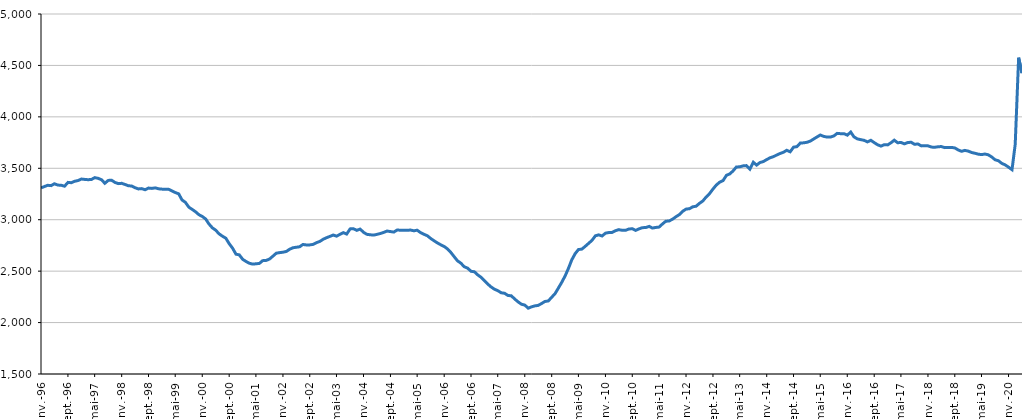
| Category | DEFMA |
|---|---|
| 1996-01-01 | 3309.5 |
| 1996-02-01 | 3322.5 |
| 1996-03-01 | 3334.6 |
| 1996-04-01 | 3331.4 |
| 1996-05-01 | 3349.6 |
| 1996-06-01 | 3336.7 |
| 1996-07-01 | 3335.2 |
| 1996-08-01 | 3325.8 |
| 1996-09-01 | 3362.8 |
| 1996-10-01 | 3359.9 |
| 1996-11-01 | 3374 |
| 1996-12-01 | 3380.7 |
| 1997-01-01 | 3395.5 |
| 1997-02-01 | 3391.6 |
| 1997-03-01 | 3389.2 |
| 1997-04-01 | 3390.8 |
| 1997-05-01 | 3409 |
| 1997-06-01 | 3402.4 |
| 1997-07-01 | 3389 |
| 1997-08-01 | 3354.3 |
| 1997-09-01 | 3382.2 |
| 1997-10-01 | 3383.7 |
| 1997-11-01 | 3362.5 |
| 1997-12-01 | 3350.9 |
| 1998-01-01 | 3353.8 |
| 1998-02-01 | 3342.4 |
| 1998-03-01 | 3330.5 |
| 1998-04-01 | 3327.6 |
| 1998-05-01 | 3311.4 |
| 1998-06-01 | 3299.3 |
| 1998-07-01 | 3302.5 |
| 1998-08-01 | 3291 |
| 1998-09-01 | 3307.6 |
| 1998-10-01 | 3304.4 |
| 1998-11-01 | 3309.6 |
| 1998-12-01 | 3300.6 |
| 1999-01-01 | 3297.3 |
| 1999-02-01 | 3296.1 |
| 1999-03-01 | 3296 |
| 1999-04-01 | 3280.4 |
| 1999-05-01 | 3264.4 |
| 1999-06-01 | 3251.5 |
| 1999-07-01 | 3192.4 |
| 1999-08-01 | 3168.6 |
| 1999-09-01 | 3121.7 |
| 1999-10-01 | 3100.4 |
| 1999-11-01 | 3077.2 |
| 1999-12-01 | 3048.8 |
| 2000-01-01 | 3031.7 |
| 2000-02-01 | 3006.3 |
| 2000-03-01 | 2958.8 |
| 2000-04-01 | 2921.1 |
| 2000-05-01 | 2898.5 |
| 2000-06-01 | 2862.4 |
| 2000-07-01 | 2840.3 |
| 2000-08-01 | 2820.3 |
| 2000-09-01 | 2766.1 |
| 2000-10-01 | 2723.5 |
| 2000-11-01 | 2664.7 |
| 2000-12-01 | 2658.2 |
| 2001-01-01 | 2614.7 |
| 2001-02-01 | 2593.5 |
| 2001-03-01 | 2577.1 |
| 2001-04-01 | 2568.5 |
| 2001-05-01 | 2571.4 |
| 2001-06-01 | 2575.1 |
| 2001-07-01 | 2602 |
| 2001-08-01 | 2603.9 |
| 2001-09-01 | 2617.7 |
| 2001-10-01 | 2645.1 |
| 2001-11-01 | 2674.4 |
| 2001-12-01 | 2679.9 |
| 2002-01-01 | 2684.1 |
| 2002-02-01 | 2691.7 |
| 2002-03-01 | 2712.2 |
| 2002-04-01 | 2727.2 |
| 2002-05-01 | 2732.2 |
| 2002-06-01 | 2737.1 |
| 2002-07-01 | 2759.4 |
| 2002-08-01 | 2754.8 |
| 2002-09-01 | 2755.2 |
| 2002-10-01 | 2760.3 |
| 2002-11-01 | 2777.1 |
| 2002-12-01 | 2789.1 |
| 2003-01-01 | 2810.5 |
| 2003-02-01 | 2825.7 |
| 2003-03-01 | 2837.3 |
| 2003-04-01 | 2850.9 |
| 2003-05-01 | 2840.1 |
| 2003-06-01 | 2857.5 |
| 2003-07-01 | 2874.4 |
| 2003-08-01 | 2860.6 |
| 2003-09-01 | 2910.9 |
| 2003-10-01 | 2912.1 |
| 2003-11-01 | 2896.8 |
| 2003-12-01 | 2909 |
| 2004-01-01 | 2876.9 |
| 2004-02-01 | 2857.6 |
| 2004-03-01 | 2853.6 |
| 2004-04-01 | 2850.4 |
| 2004-05-01 | 2857.4 |
| 2004-06-01 | 2865.9 |
| 2004-07-01 | 2876.5 |
| 2004-08-01 | 2889.9 |
| 2004-09-01 | 2884.6 |
| 2004-10-01 | 2879.9 |
| 2004-11-01 | 2899.9 |
| 2004-12-01 | 2897.8 |
| 2005-01-01 | 2898.3 |
| 2005-02-01 | 2897.2 |
| 2005-03-01 | 2899.6 |
| 2005-04-01 | 2892.3 |
| 2005-05-01 | 2898 |
| 2005-06-01 | 2874 |
| 2005-07-01 | 2858.5 |
| 2005-08-01 | 2843.9 |
| 2005-09-01 | 2817 |
| 2005-10-01 | 2795 |
| 2005-11-01 | 2773.7 |
| 2005-12-01 | 2756 |
| 2006-01-01 | 2739.3 |
| 2006-02-01 | 2714.5 |
| 2006-03-01 | 2682.5 |
| 2006-04-01 | 2640.7 |
| 2006-05-01 | 2600.5 |
| 2006-06-01 | 2577 |
| 2006-07-01 | 2543.1 |
| 2006-08-01 | 2529 |
| 2006-09-01 | 2498.4 |
| 2006-10-01 | 2493.8 |
| 2006-11-01 | 2463.2 |
| 2006-12-01 | 2439.6 |
| 2007-01-01 | 2406.5 |
| 2007-02-01 | 2372.9 |
| 2007-03-01 | 2346.5 |
| 2007-04-01 | 2324.2 |
| 2007-05-01 | 2310.5 |
| 2007-06-01 | 2289.6 |
| 2007-07-01 | 2285.2 |
| 2007-08-01 | 2263.7 |
| 2007-09-01 | 2260.3 |
| 2007-10-01 | 2229.4 |
| 2007-11-01 | 2201.2 |
| 2007-12-01 | 2178.6 |
| 2008-01-01 | 2169.8 |
| 2008-02-01 | 2140 |
| 2008-03-01 | 2152.6 |
| 2008-04-01 | 2162.3 |
| 2008-05-01 | 2166.8 |
| 2008-06-01 | 2185.4 |
| 2008-07-01 | 2204.9 |
| 2008-08-01 | 2210.5 |
| 2008-09-01 | 2246.6 |
| 2008-10-01 | 2281.6 |
| 2008-11-01 | 2337.3 |
| 2008-12-01 | 2392.2 |
| 2009-01-01 | 2455.5 |
| 2009-02-01 | 2531.6 |
| 2009-03-01 | 2608.9 |
| 2009-04-01 | 2670 |
| 2009-05-01 | 2710.1 |
| 2009-06-01 | 2714.2 |
| 2009-07-01 | 2740.9 |
| 2009-08-01 | 2770.2 |
| 2009-09-01 | 2799.8 |
| 2009-10-01 | 2843.4 |
| 2009-11-01 | 2852.8 |
| 2009-12-01 | 2841.8 |
| 2010-01-01 | 2869.3 |
| 2010-02-01 | 2875.5 |
| 2010-03-01 | 2876.2 |
| 2010-04-01 | 2893 |
| 2010-05-01 | 2903.3 |
| 2010-06-01 | 2897.5 |
| 2010-07-01 | 2896.6 |
| 2010-08-01 | 2909.8 |
| 2010-09-01 | 2912.2 |
| 2010-10-01 | 2896.1 |
| 2010-11-01 | 2911.2 |
| 2010-12-01 | 2922.6 |
| 2011-01-01 | 2924 |
| 2011-02-01 | 2934.8 |
| 2011-03-01 | 2919 |
| 2011-04-01 | 2924.7 |
| 2011-05-01 | 2928.4 |
| 2011-06-01 | 2958.5 |
| 2011-07-01 | 2985.2 |
| 2011-08-01 | 2988 |
| 2011-09-01 | 3005.5 |
| 2011-10-01 | 3028.8 |
| 2011-11-01 | 3049.5 |
| 2011-12-01 | 3081.8 |
| 2012-01-01 | 3103.2 |
| 2012-02-01 | 3107.2 |
| 2012-03-01 | 3125.3 |
| 2012-04-01 | 3131.4 |
| 2012-05-01 | 3159 |
| 2012-06-01 | 3182.3 |
| 2012-07-01 | 3221.1 |
| 2012-08-01 | 3254 |
| 2012-09-01 | 3298.8 |
| 2012-10-01 | 3337.3 |
| 2012-11-01 | 3365.2 |
| 2012-12-01 | 3380.1 |
| 2013-01-01 | 3432 |
| 2013-02-01 | 3445.9 |
| 2013-03-01 | 3474 |
| 2013-04-01 | 3512.9 |
| 2013-05-01 | 3514.4 |
| 2013-06-01 | 3523.4 |
| 2013-07-01 | 3526.2 |
| 2013-08-01 | 3491.9 |
| 2013-09-01 | 3558.9 |
| 2013-10-01 | 3531.1 |
| 2013-11-01 | 3556.2 |
| 2013-12-01 | 3565.4 |
| 2014-01-01 | 3584.9 |
| 2014-02-01 | 3602.7 |
| 2014-03-01 | 3612.4 |
| 2014-04-01 | 3628.8 |
| 2014-05-01 | 3643.5 |
| 2014-06-01 | 3655.9 |
| 2014-07-01 | 3674.9 |
| 2014-08-01 | 3660.2 |
| 2014-09-01 | 3705.7 |
| 2014-10-01 | 3710.2 |
| 2014-11-01 | 3745.6 |
| 2014-12-01 | 3747.3 |
| 2015-01-01 | 3752.9 |
| 2015-02-01 | 3765.2 |
| 2015-03-01 | 3784.1 |
| 2015-04-01 | 3804.3 |
| 2015-05-01 | 3823.5 |
| 2015-06-01 | 3810.1 |
| 2015-07-01 | 3803.5 |
| 2015-08-01 | 3803.3 |
| 2015-09-01 | 3814.8 |
| 2015-10-01 | 3839.4 |
| 2015-11-01 | 3836.4 |
| 2015-12-01 | 3836.8 |
| 2016-01-01 | 3822.3 |
| 2016-02-01 | 3852.4 |
| 2016-03-01 | 3805.8 |
| 2016-04-01 | 3785.9 |
| 2016-05-01 | 3778.4 |
| 2016-06-01 | 3771.8 |
| 2016-07-01 | 3756.6 |
| 2016-08-01 | 3772.1 |
| 2016-09-01 | 3749.2 |
| 2016-10-01 | 3728.8 |
| 2016-11-01 | 3715.5 |
| 2016-12-01 | 3729.7 |
| 2017-01-01 | 3727.5 |
| 2017-02-01 | 3749.4 |
| 2017-03-01 | 3773.3 |
| 2017-04-01 | 3748.5 |
| 2017-05-01 | 3750.9 |
| 2017-06-01 | 3737.6 |
| 2017-07-01 | 3750.1 |
| 2017-08-01 | 3753.2 |
| 2017-09-01 | 3733.1 |
| 2017-10-01 | 3736.5 |
| 2017-11-01 | 3717.8 |
| 2017-12-01 | 3719.6 |
| 2018-01-01 | 3718.2 |
| 2018-02-01 | 3706.3 |
| 2018-03-01 | 3704.1 |
| 2018-04-01 | 3709 |
| 2018-05-01 | 3711.6 |
| 2018-06-01 | 3700.8 |
| 2018-07-01 | 3702.5 |
| 2018-08-01 | 3703.1 |
| 2018-09-01 | 3697.9 |
| 2018-10-01 | 3678.3 |
| 2018-11-01 | 3665.1 |
| 2018-12-01 | 3674 |
| 2019-01-01 | 3666.7 |
| 2019-02-01 | 3653.3 |
| 2019-03-01 | 3646.4 |
| 2019-04-01 | 3637.3 |
| 2019-05-01 | 3633.3 |
| 2019-06-01 | 3638.7 |
| 2019-07-01 | 3630.9 |
| 2019-08-01 | 3610.3 |
| 2019-09-01 | 3582.6 |
| 2019-10-01 | 3573.2 |
| 2019-11-01 | 3547.4 |
| 2019-12-01 | 3533.2 |
| 2020-01-01 | 3510.3 |
| 2020-02-01 | 3486.4 |
| 2020-03-01 | 3732.5 |
| 2020-04-01 | 4575.5 |
| 2020-05-01 | 4425.6 |